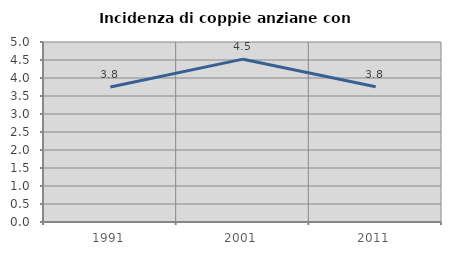
| Category | Incidenza di coppie anziane con figli |
|---|---|
| 1991.0 | 3.752 |
| 2001.0 | 4.523 |
| 2011.0 | 3.759 |